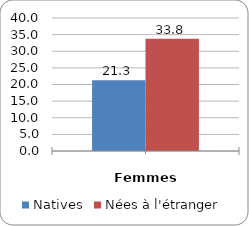
| Category | Natives | Nées à l'étranger |
|---|---|---|
|  | 21.259 | 33.793 |